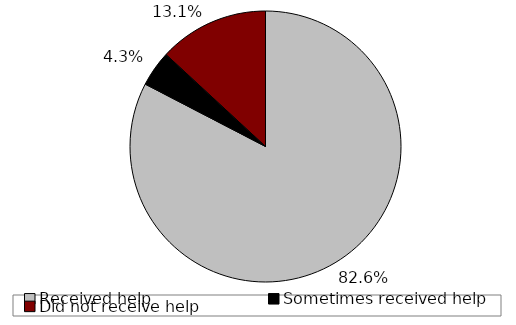
| Category | Share  |
|---|---|
| Received help  | 0.826 |
| Sometimes received help  | 0.043 |
| Did not receive help | 0.131 |